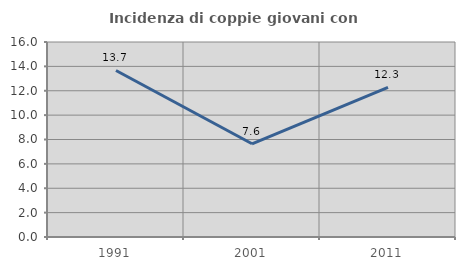
| Category | Incidenza di coppie giovani con figli |
|---|---|
| 1991.0 | 13.665 |
| 2001.0 | 7.647 |
| 2011.0 | 12.281 |